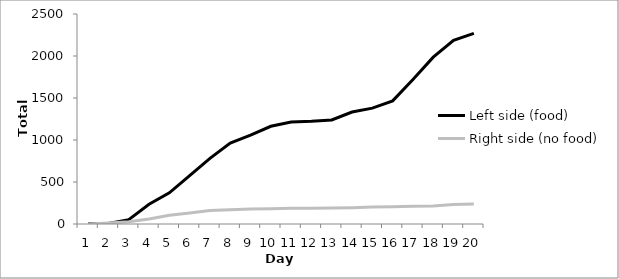
| Category | Left side (food) | Right side (no food) |
|---|---|---|
| 0 | 3 | 1 |
| 1 | 7 | 12 |
| 2 | 52 | 26 |
| 3 | 235 | 60 |
| 4 | 371 | 104 |
| 5 | 576 | 132 |
| 6 | 782 | 160 |
| 7 | 964 | 170 |
| 8 | 1058 | 179 |
| 9 | 1163 | 182 |
| 10 | 1215 | 187 |
| 11 | 1222 | 187 |
| 12 | 1239 | 190 |
| 13 | 1333 | 194 |
| 14 | 1379 | 201 |
| 15 | 1466 | 205 |
| 16 | 1720 | 210 |
| 17 | 1986 | 213 |
| 18 | 2186 | 231 |
| 19 | 2270 | 237 |